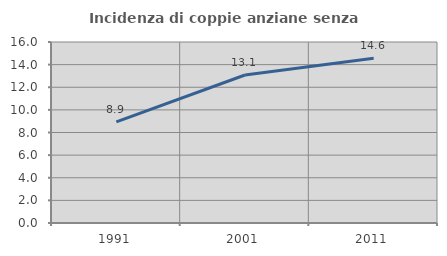
| Category | Incidenza di coppie anziane senza figli  |
|---|---|
| 1991.0 | 8.945 |
| 2001.0 | 13.083 |
| 2011.0 | 14.569 |